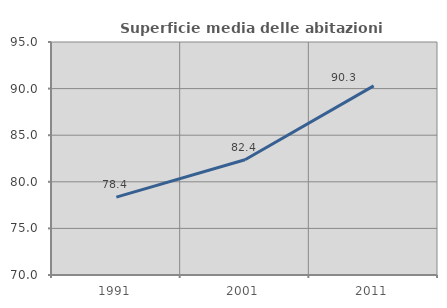
| Category | Superficie media delle abitazioni occupate |
|---|---|
| 1991.0 | 78.35 |
| 2001.0 | 82.362 |
| 2011.0 | 90.298 |